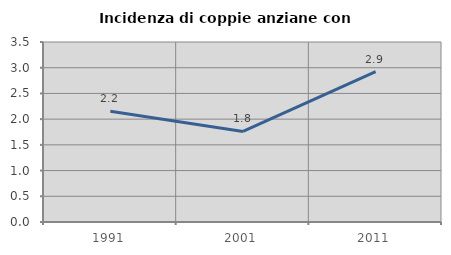
| Category | Incidenza di coppie anziane con figli |
|---|---|
| 1991.0 | 2.155 |
| 2001.0 | 1.761 |
| 2011.0 | 2.924 |